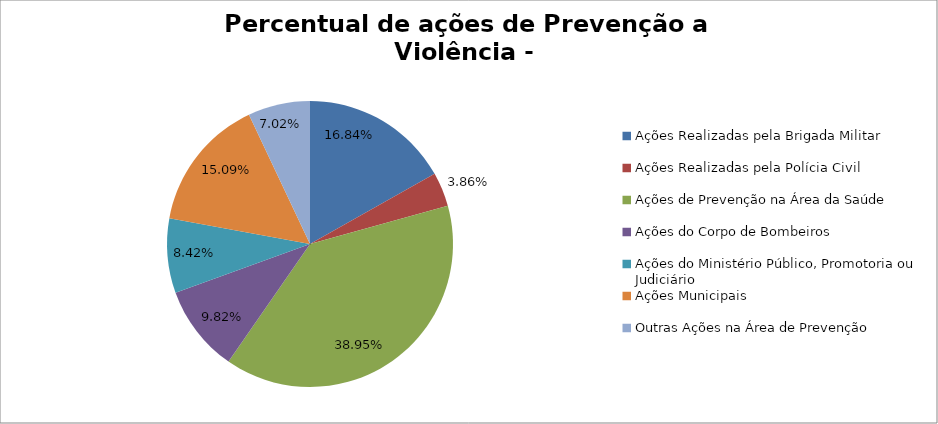
| Category | Percentual |
|---|---|
| Ações Realizadas pela Brigada Militar | 0.168 |
| Ações Realizadas pela Polícia Civil | 0.039 |
| Ações de Prevenção na Área da Saúde | 0.389 |
| Ações do Corpo de Bombeiros | 0.098 |
| Ações do Ministério Público, Promotoria ou Judiciário | 0.084 |
| Ações Municipais | 0.151 |
| Outras Ações na Área de Prevenção | 0.07 |